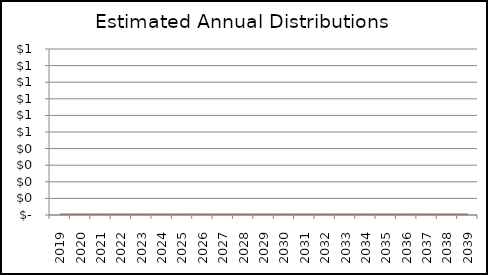
| Category | Series 0 |
|---|---|
| 2019.0 | 0 |
| 2020.0 | 0 |
| 2021.0 | 0 |
| 2022.0 | 0 |
| 2023.0 | 0 |
| 2024.0 | 0 |
| 2025.0 | 0 |
| 2026.0 | 0 |
| 2027.0 | 0 |
| 2028.0 | 0 |
| 2029.0 | 0 |
| 2030.0 | 0 |
| 2031.0 | 0 |
| 2032.0 | 0 |
| 2033.0 | 0 |
| 2034.0 | 0 |
| 2035.0 | 0 |
| 2036.0 | 0 |
| 2037.0 | 0 |
| 2038.0 | 0 |
| 2039.0 | 0 |